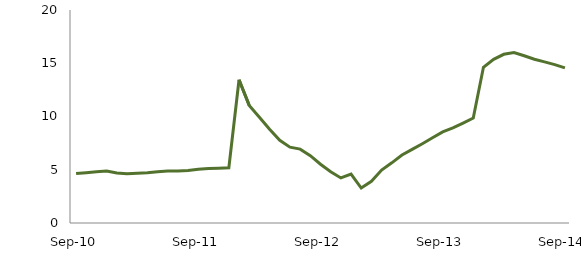
| Category | Series 0 |
|---|---|
| Sep-10 | 4.639 |
|  | 4.726 |
|  | 4.816 |
|  | 4.886 |
|  | 4.703 |
|  | 4.632 |
|  | 4.674 |
|  | 4.715 |
|  | 4.818 |
|  | 4.876 |
|  | 4.891 |
|  | 4.923 |
| Sep-11 | 5.055 |
|  | 5.115 |
|  | 5.14 |
|  | 5.184 |
|  | 13.448 |
|  | 11.044 |
|  | 9.928 |
|  | 8.811 |
|  | 7.762 |
|  | 7.121 |
|  | 6.936 |
|  | 6.325 |
| Sep-12 | 5.519 |
|  | 4.806 |
|  | 4.231 |
|  | 4.589 |
|  | 3.285 |
|  | 3.908 |
|  | 4.967 |
|  | 5.65 |
|  | 6.385 |
|  | 6.913 |
|  | 7.445 |
|  | 8.003 |
| Sep-13 | 8.554 |
|  | 8.933 |
|  | 9.386 |
|  | 9.861 |
|  | 14.619 |
|  | 15.361 |
|  | 15.84 |
|  | 15.998 |
|  | 15.703 |
|  | 15.38 |
|  | 15.129 |
|  | 14.869 |
| Sep-14 | 14.566 |